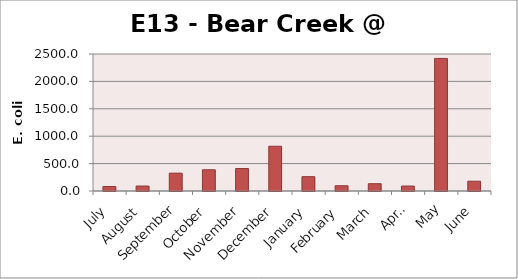
| Category | E. coli MPN |
|---|---|
| July | 82.3 |
| August | 90.6 |
| September | 325.5 |
| October | 387.3 |
| November | 410.6 |
| December | 816.4 |
| January | 261.3 |
| February | 95.9 |
| March | 133.3 |
| April | 90.6 |
| May | 2419.2 |
| June | 178.5 |